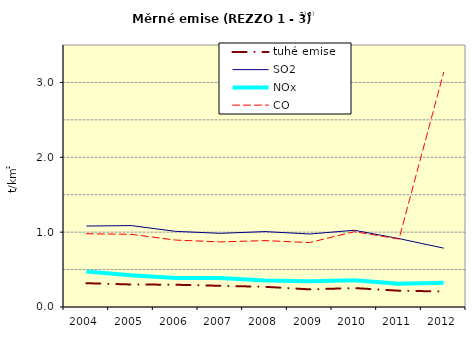
| Category | tuhé emise | SO2 | NOx | CO |
|---|---|---|---|---|
| 2004.0 | 0.318 | 1.082 | 0.474 | 0.978 |
| 2005.0 | 0.301 | 1.088 | 0.424 | 0.971 |
| 2006.0 | 0.297 | 1.01 | 0.388 | 0.894 |
| 2007.0 | 0.283 | 0.984 | 0.388 | 0.87 |
| 2008.0 | 0.27 | 1.007 | 0.353 | 0.887 |
| 2009.0 | 0.236 | 0.975 | 0.344 | 0.861 |
| 2010.0 | 0.253 | 1.025 | 0.357 | 1.006 |
| 2011.0 | 0.218 | 0.914 | 0.31 | 0.908 |
| 2012.0 | 0.207 | 0.786 | 0.323 | 3.134 |